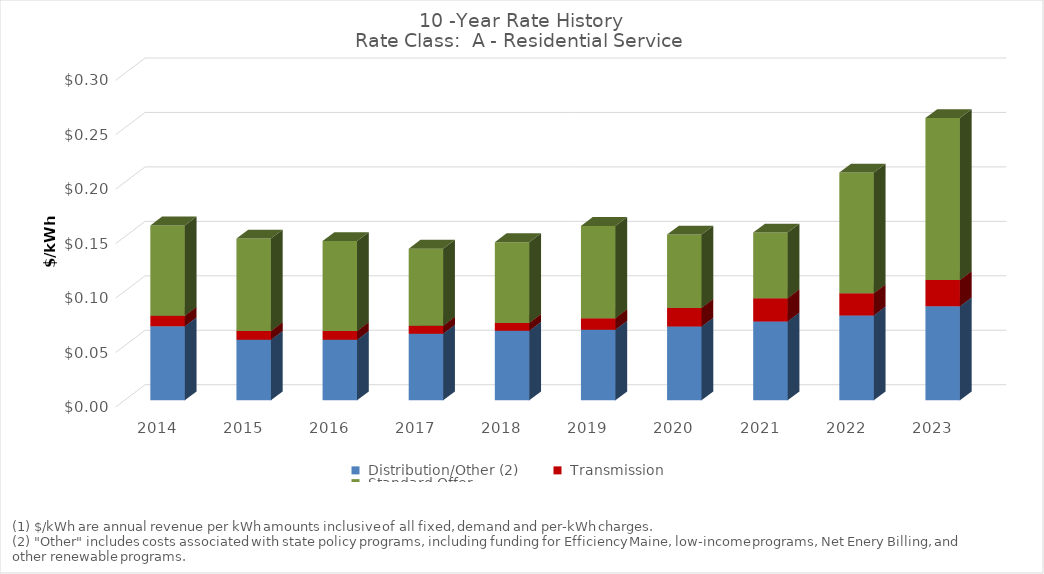
| Category | Series 1 | Series 2 | Series 3 |
|---|---|---|---|
| 2014.0 | 0.068 | 0.01 | 0.083 |
| 2015.0 | 0.056 | 0.008 | 0.085 |
| 2016.0 | 0.056 | 0.008 | 0.083 |
| 2017.0 | 0.061 | 0.007 | 0.071 |
| 2018.0 | 0.064 | 0.007 | 0.074 |
| 2019.0 | 0.065 | 0.011 | 0.085 |
| 2020.0 | 0.068 | 0.017 | 0.067 |
| 2021.0 | 0.072 | 0.021 | 0.06 |
| 2022.0 | 0.078 | 0.02 | 0.111 |
| 2023.0 | 0.086 | 0.024 | 0.149 |